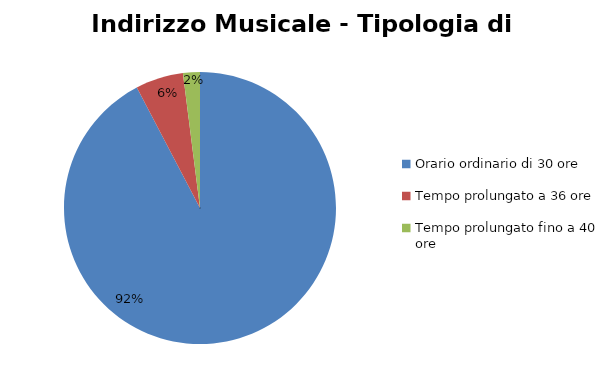
| Category | Series 0 | Series 1 |
|---|---|---|
| Orario ordinario di 30 ore | 2713 |  |
| Tempo prolungato a 36 ore | 167 |  |
| Tempo prolungato fino a 40 ore | 59 |  |